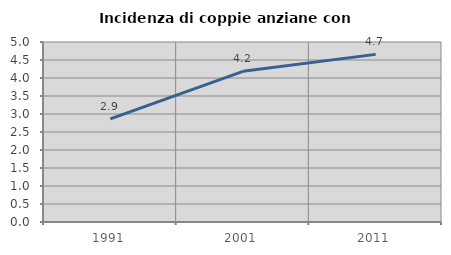
| Category | Incidenza di coppie anziane con figli |
|---|---|
| 1991.0 | 2.863 |
| 2001.0 | 4.185 |
| 2011.0 | 4.656 |